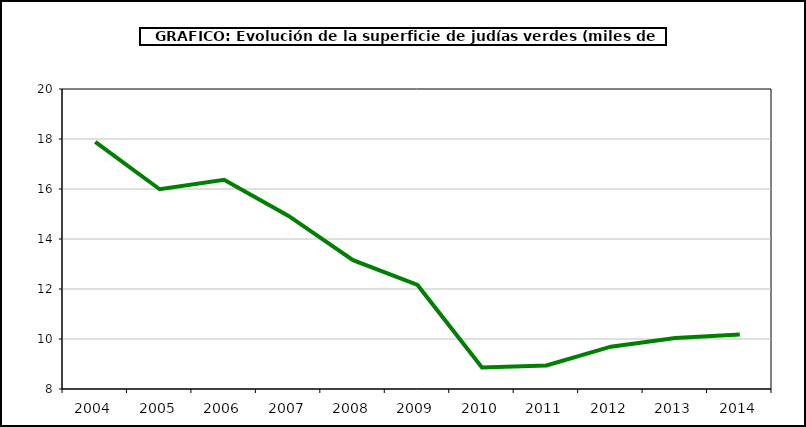
| Category | superficie |
|---|---|
| 2004.0 | 17.884 |
| 2005.0 | 15.989 |
| 2006.0 | 16.366 |
| 2007.0 | 14.921 |
| 2008.0 | 13.153 |
| 2009.0 | 12.162 |
| 2010.0 | 8.857 |
| 2011.0 | 8.939 |
| 2012.0 | 9.694 |
| 2013.0 | 10.041 |
| 2014.0 | 10.18 |